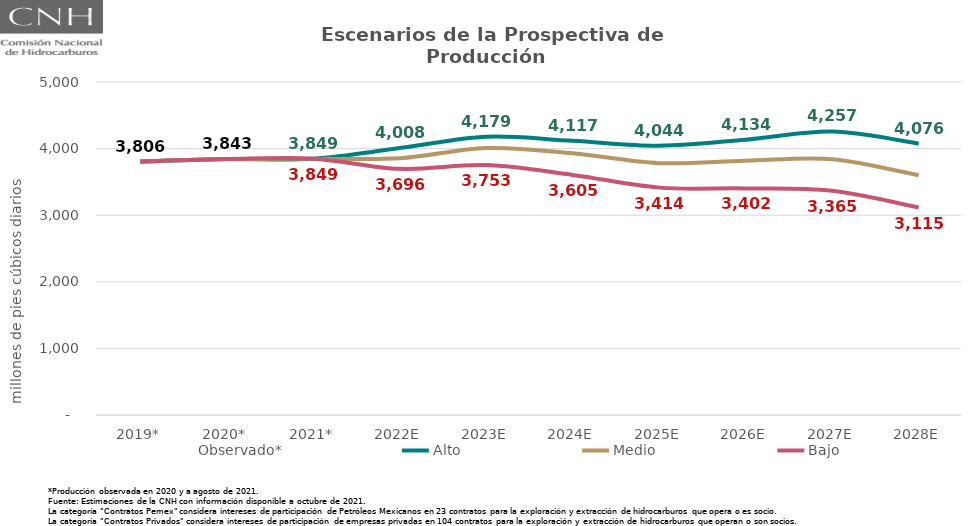
| Category | Observado* | Alto | Medio | Bajo |
|---|---|---|---|---|
| 2019* | 3805.803 | 3805.803 | 3805.803 | 3805.803 |
| 2020* | 3843.294 | 3843.294 | 3843.294 | 3843.294 |
| 2021* | 3849.199 | 3849.199 | 3849.199 | 3849.199 |
| 2022E | 3853.981 | 4008.376 | 3853.981 | 3695.897 |
| 2023E | 4008.421 | 4179.05 | 4008.421 | 3752.533 |
| 2024E | 3929.344 | 4117.394 | 3929.344 | 3605.114 |
| 2025E | 3781.721 | 4043.836 | 3781.721 | 3414.018 |
| 2026E | 3818.195 | 4134.109 | 3818.195 | 3401.955 |
| 2027E | 3841.453 | 4256.774 | 3841.453 | 3365.437 |
| 2028E | 3597.706 | 4076.424 | 3597.706 | 3114.746 |